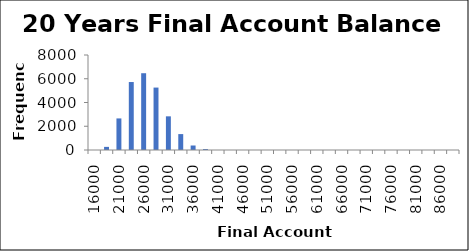
| Category | Frequency |
|---|---|
| 16000.0 | 0 |
| 18500.0 | 263 |
| 21000.0 | 2659 |
| 23500.0 | 5724 |
| 26000.0 | 6466 |
| 28500.0 | 5257 |
| 31000.0 | 2835 |
| 33500.0 | 1340 |
| 36000.0 | 379 |
| 38500.0 | 77 |
| 41000.0 | 0 |
| 43500.0 | 0 |
| 46000.0 | 0 |
| 48500.0 | 0 |
| 51000.0 | 0 |
| 53500.0 | 0 |
| 56000.0 | 0 |
| 58500.0 | 0 |
| 61000.0 | 0 |
| 63500.0 | 0 |
| 66000.0 | 0 |
| 68500.0 | 0 |
| 71000.0 | 0 |
| 73500.0 | 0 |
| 76000.0 | 0 |
| 78500.0 | 0 |
| 81000.0 | 0 |
| 83500.0 | 0 |
| 86000.0 | 0 |
| More | 0 |